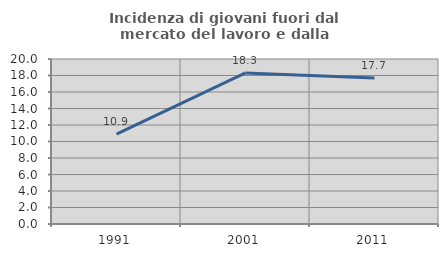
| Category | Incidenza di giovani fuori dal mercato del lavoro e dalla formazione  |
|---|---|
| 1991.0 | 10.898 |
| 2001.0 | 18.313 |
| 2011.0 | 17.698 |